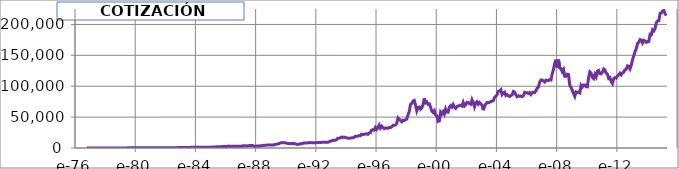
| Category | COTIZACIÓN BERKSHIRE |
|---|---|
| 1976-10-14 | 67 |
| 1976-11-14 | 66 |
| 1976-12-14 | 80 |
| 1977-01-14 | 94 |
| 1977-02-14 | 92 |
| 1977-03-14 | 88 |
| 1977-04-14 | 95 |
| 1977-05-14 | 95 |
| 1977-06-14 | 100 |
| 1977-07-14 | 100 |
| 1977-08-14 | 102 |
| 1977-09-14 | 103 |
| 1977-10-14 | 108 |
| 1977-11-14 | 110 |
| 1977-12-14 | 132 |
| 1978-01-14 | 136 |
| 1978-02-14 | 134 |
| 1978-03-14 | 138 |
| 1978-04-14 | 145 |
| 1978-05-14 | 150 |
| 1978-06-14 | 180 |
| 1978-07-14 | 165 |
| 1978-08-14 | 168 |
| 1978-09-14 | 175 |
| 1978-10-14 | 185 |
| 1978-11-14 | 168 |
| 1978-12-14 | 160 |
| 1979-01-14 | 156 |
| 1979-02-14 | 158 |
| 1979-03-14 | 178 |
| 1979-04-14 | 185 |
| 1979-05-14 | 190 |
| 1979-06-14 | 192 |
| 1979-07-14 | 240 |
| 1979-08-14 | 320 |
| 1979-09-14 | 340 |
| 1979-10-14 | 305 |
| 1979-11-14 | 290 |
| 1979-12-14 | 330 |
| 1980-01-14 | 335 |
| 1980-02-14 | 340 |
| 1980-03-14 | 285 |
| 1980-04-14 | 255 |
| 1980-05-14 | 310 |
| 1980-06-14 | 320 |
| 1980-07-14 | 325 |
| 1980-08-14 | 380 |
| 1980-09-14 | 400 |
| 1980-10-14 | 400 |
| 1980-11-14 | 400 |
| 1980-12-14 | 425 |
| 1981-01-14 | 425 |
| 1981-02-14 | 425 |
| 1981-03-14 | 485 |
| 1981-04-14 | 495 |
| 1981-05-14 | 525 |
| 1981-06-14 | 525 |
| 1981-07-14 | 480 |
| 1981-08-14 | 520 |
| 1981-09-14 | 485 |
| 1981-10-14 | 470 |
| 1981-11-14 | 515 |
| 1981-12-14 | 555 |
| 1982-01-14 | 540 |
| 1982-02-14 | 510 |
| 1982-03-14 | 475 |
| 1982-04-14 | 510 |
| 1982-05-14 | 520 |
| 1982-06-14 | 485 |
| 1982-07-14 | 475 |
| 1982-08-14 | 430 |
| 1982-09-14 | 525 |
| 1982-10-14 | 600 |
| 1982-11-14 | 690 |
| 1982-12-14 | 710 |
| 1983-01-14 | 785 |
| 1983-02-14 | 780 |
| 1983-03-14 | 870 |
| 1983-04-14 | 905 |
| 1983-05-14 | 970 |
| 1983-06-14 | 970 |
| 1983-07-14 | 910 |
| 1983-08-14 | 965 |
| 1983-09-14 | 1145 |
| 1983-10-14 | 1285 |
| 1983-11-14 | 1310 |
| 1983-12-14 | 1370 |
| 1984-01-14 | 1360 |
| 1984-02-14 | 1285 |
| 1984-03-14 | 1270 |
| 1984-04-14 | 1235 |
| 1984-05-14 | 1325 |
| 1984-06-14 | 1285 |
| 1984-07-14 | 1240 |
| 1984-08-14 | 1285 |
| 1984-09-14 | 1295 |
| 1984-10-14 | 1300 |
| 1984-11-14 | 1300 |
| 1984-12-14 | 1265 |
| 1985-01-14 | 1305 |
| 1985-02-14 | 1485 |
| 1985-03-14 | 1480 |
| 1985-04-14 | 1730 |
| 1985-05-14 | 1845 |
| 1985-06-14 | 1900 |
| 1985-07-14 | 2205 |
| 1985-08-14 | 2070 |
| 1985-09-14 | 2065 |
| 1985-10-14 | 2190 |
| 1985-11-14 | 2630 |
| 1985-12-14 | 2620 |
| 1986-01-14 | 2450 |
| 1986-02-14 | 2435 |
| 1986-03-14 | 3200 |
| 1986-04-14 | 2800 |
| 1986-05-14 | 2780 |
| 1986-06-14 | 2820 |
| 1986-07-14 | 2800 |
| 1986-08-14 | 3050 |
| 1986-09-14 | 2675 |
| 1986-10-14 | 2690 |
| 1986-11-14 | 2880 |
| 1986-12-14 | 2730 |
| 1987-01-14 | 3050 |
| 1987-02-14 | 3125 |
| 1987-03-14 | 3630 |
| 1987-04-14 | 3390 |
| 1987-05-14 | 3510 |
| 1987-06-14 | 3380 |
| 1987-07-14 | 3550 |
| 1987-08-14 | 4180 |
| 1987-09-14 | 3890 |
| 1987-10-14 | 4140 |
| 1987-11-14 | 3025 |
| 1987-12-14 | 2975 |
| 1988-01-14 | 3030 |
| 1988-02-14 | 3050 |
| 1988-03-14 | 3150 |
| 1988-04-14 | 3450 |
| 1988-05-14 | 3725 |
| 1988-06-14 | 3950 |
| 1988-07-14 | 4375 |
| 1988-08-14 | 4200 |
| 1988-09-14 | 4550 |
| 1988-10-14 | 4850 |
| 1988-11-14 | 4700 |
| 1988-12-14 | 4900 |
| 1989-01-14 | 4700 |
| 1989-02-14 | 4825 |
| 1989-03-14 | 4785 |
| 1989-04-14 | 5850 |
| 1989-05-14 | 5900 |
| 1989-06-14 | 6675 |
| 1989-07-14 | 6875 |
| 1989-08-14 | 8005 |
| 1989-09-14 | 8700 |
| 1989-10-14 | 8300 |
| 1989-11-14 | 8305 |
| 1989-12-14 | 8475 |
| 1990-01-14 | 8175 |
| 1990-02-14 | 7425 |
| 1990-03-14 | 7120 |
| 1990-04-14 | 6975 |
| 1990-05-14 | 7575 |
| 1990-06-14 | 7225 |
| 1990-07-14 | 7300 |
| 1990-08-14 | 6900 |
| 1990-09-14 | 6225 |
| 1990-10-14 | 5735 |
| 1990-11-14 | 6275 |
| 1990-12-14 | 6750 |
| 1991-01-14 | 6610 |
| 1991-02-14 | 7625 |
| 1991-03-14 | 7975 |
| 1991-04-14 | 8000 |
| 1991-05-14 | 8000 |
| 1991-06-14 | 8475 |
| 1991-07-14 | 8600 |
| 1991-08-14 | 8900 |
| 1991-09-14 | 8450 |
| 1991-10-14 | 8450 |
| 1991-11-14 | 8525 |
| 1991-12-14 | 8375 |
| 1992-01-14 | 8750 |
| 1992-02-14 | 8750 |
| 1992-03-14 | 8850 |
| 1992-04-14 | 8925 |
| 1992-05-14 | 9100 |
| 1992-06-14 | 9110 |
| 1992-07-14 | 9425 |
| 1992-08-14 | 9500 |
| 1992-09-14 | 9200 |
| 1992-10-14 | 9405 |
| 1992-11-14 | 9800 |
| 1992-12-14 | 11150 |
| 1993-01-14 | 11450 |
| 1993-02-14 | 12400 |
| 1993-03-14 | 12700 |
| 1993-04-14 | 12525 |
| 1993-05-14 | 13500 |
| 1993-06-14 | 15725 |
| 1993-07-14 | 15900 |
| 1993-08-14 | 16350 |
| 1993-09-14 | 17710 |
| 1993-10-14 | 17125 |
| 1993-11-14 | 17650 |
| 1993-12-14 | 16900 |
| 1994-01-14 | 16700 |
| 1994-02-14 | 15900 |
| 1994-03-14 | 15650 |
| 1994-04-14 | 16150 |
| 1994-05-14 | 16400 |
| 1994-06-14 | 16500 |
| 1994-07-14 | 17300 |
| 1994-08-14 | 19000 |
| 1994-09-14 | 18900 |
| 1994-10-14 | 19200 |
| 1994-11-14 | 20000 |
| 1994-12-14 | 20000 |
| 1995-01-14 | 22300 |
| 1995-02-14 | 21600 |
| 1995-03-14 | 22200 |
| 1995-04-14 | 22600 |
| 1995-05-14 | 22950 |
| 1995-06-14 | 22200 |
| 1995-07-14 | 24350 |
| 1995-08-14 | 24900 |
| 1995-09-14 | 29000 |
| 1995-10-14 | 29650 |
| 1995-11-14 | 29000 |
| 1995-12-14 | 33300 |
| 1996-01-14 | 30200 |
| 1996-02-14 | 33000 |
| 1996-03-14 | 37100 |
| 1996-04-14 | 32200 |
| 1996-05-14 | 35300 |
| 1996-06-14 | 33100 |
| 1996-07-14 | 31275 |
| 1996-08-14 | 32500 |
| 1996-09-14 | 32150 |
| 1996-10-14 | 31900 |
| 1996-11-14 | 33400 |
| 1996-12-14 | 33000 |
| 1997-01-14 | 34300 |
| 1997-02-14 | 36400 |
| 1997-03-14 | 36900 |
| 1997-04-14 | 37100 |
| 1997-05-14 | 39900 |
| 1997-06-14 | 48600 |
| 1997-07-14 | 46400 |
| 1997-08-14 | 44700 |
| 1997-09-14 | 42500 |
| 1997-10-14 | 45000 |
| 1997-11-14 | 44400 |
| 1997-12-14 | 45700 |
| 1998-01-14 | 46900 |
| 1998-02-14 | 53900 |
| 1998-03-14 | 59300 |
| 1998-04-14 | 70500 |
| 1998-05-14 | 72100 |
| 1998-06-14 | 76000 |
| 1998-07-14 | 77000 |
| 1998-08-14 | 69710 |
| 1998-09-14 | 60200 |
| 1998-10-14 | 65600 |
| 1998-11-14 | 66400 |
| 1998-12-14 | 62800 |
| 1999-01-14 | 64600 |
| 1999-02-14 | 71100 |
| 1999-03-14 | 80300 |
| 1999-04-14 | 73000 |
| 1999-05-14 | 74300 |
| 1999-06-14 | 70800 |
| 1999-07-14 | 71400 |
| 1999-08-14 | 66100 |
| 1999-09-14 | 59800 |
| 1999-10-14 | 57500 |
| 1999-11-14 | 60300 |
| 1999-12-14 | 53400 |
| 2000-01-14 | 52200 |
| 2000-02-14 | 43100 |
| 2000-03-14 | 44000 |
| 2000-04-14 | 58000 |
| 2000-05-14 | 55000 |
| 2000-06-14 | 58700 |
| 2000-07-14 | 54900 |
| 2000-08-14 | 63200 |
| 2000-09-14 | 58100 |
| 2000-10-14 | 58000 |
| 2000-11-14 | 66200 |
| 2000-12-14 | 68600 |
| 2001-01-14 | 66200 |
| 2001-02-14 | 70300 |
| 2001-03-14 | 65900 |
| 2001-04-14 | 64100 |
| 2001-05-14 | 67200 |
| 2001-06-14 | 67700 |
| 2001-07-14 | 69100 |
| 2001-08-14 | 69100 |
| 2001-09-14 | 68000 |
| 2001-10-14 | 73900 |
| 2001-11-14 | 68000 |
| 2001-12-14 | 69950 |
| 2002-01-14 | 73900 |
| 2002-02-14 | 73600 |
| 2002-03-14 | 72000 |
| 2002-04-14 | 71000 |
| 2002-05-14 | 78000 |
| 2002-06-14 | 73000 |
| 2002-07-14 | 66600 |
| 2002-08-14 | 73400 |
| 2002-09-14 | 75000 |
| 2002-10-14 | 70910 |
| 2002-11-14 | 73600 |
| 2002-12-14 | 71200 |
| 2003-01-14 | 69700 |
| 2003-02-14 | 61200 |
| 2003-03-14 | 68100 |
| 2003-04-14 | 70990 |
| 2003-05-14 | 73600 |
| 2003-06-14 | 73300 |
| 2003-07-14 | 74000 |
| 2003-08-14 | 75300 |
| 2003-09-14 | 75800 |
| 2003-10-14 | 76600 |
| 2003-11-14 | 81790 |
| 2003-12-14 | 83600 |
| 2004-01-14 | 86005 |
| 2004-02-14 | 91900 |
| 2004-03-14 | 92150 |
| 2004-04-14 | 94200 |
| 2004-05-14 | 86500 |
| 2004-06-14 | 89100.06 |
| 2004-07-14 | 90400 |
| 2004-08-14 | 85100 |
| 2004-09-14 | 86300 |
| 2004-10-14 | 84400 |
| 2004-11-14 | 83300 |
| 2004-12-14 | 85100 |
| 2005-01-14 | 85850 |
| 2005-02-14 | 91480 |
| 2005-03-14 | 90600 |
| 2005-04-14 | 86000 |
| 2005-05-14 | 83000 |
| 2005-06-14 | 84400 |
| 2005-07-14 | 83700 |
| 2005-08-14 | 84200 |
| 2005-09-14 | 83100 |
| 2005-10-14 | 84600 |
| 2005-11-14 | 90140 |
| 2005-12-14 | 89200.06 |
| 2006-01-14 | 89600 |
| 2006-02-14 | 88100 |
| 2006-03-14 | 89750 |
| 2006-04-14 | 86700 |
| 2006-05-14 | 89503 |
| 2006-06-14 | 90100 |
| 2006-07-14 | 89800 |
| 2006-08-14 | 92685 |
| 2006-09-14 | 96900 |
| 2006-10-14 | 98600 |
| 2006-11-14 | 106475 |
| 2006-12-14 | 110100 |
| 2007-01-14 | 110000 |
| 2007-02-14 | 108500 |
| 2007-03-14 | 106800 |
| 2007-04-14 | 109900 |
| 2007-05-14 | 109350 |
| 2007-06-14 | 109300 |
| 2007-07-14 | 110710 |
| 2007-08-14 | 110150 |
| 2007-09-14 | 120000 |
| 2007-10-14 | 127100 |
| 2007-11-14 | 137500 |
| 2007-12-14 | 143000 |
| 2008-01-14 | 130410 |
| 2008-02-14 | 142990 |
| 2008-03-14 | 129360 |
| 2008-04-14 | 128515 |
| 2008-05-14 | 123500 |
| 2008-06-14 | 127000 |
| 2008-07-14 | 116000 |
| 2008-08-14 | 116200 |
| 2008-09-14 | 119500 |
| 2008-10-14 | 118850 |
| 2008-11-14 | 101000 |
| 2008-12-14 | 98390 |
| 2009-01-14 | 93150 |
| 2009-02-14 | 88140 |
| 2009-03-14 | 83550 |
| 2009-04-14 | 90700 |
| 2009-05-14 | 89600 |
| 2009-06-14 | 90870 |
| 2009-07-14 | 89400 |
| 2009-08-14 | 101400 |
| 2009-09-14 | 98750 |
| 2009-10-14 | 102000 |
| 2009-11-14 | 102055 |
| 2009-12-14 | 99400 |
| 2010-01-14 | 99000 |
| 2010-02-14 | 114000 |
| 2010-03-14 | 123200 |
| 2010-04-14 | 121100 |
| 2010-05-14 | 114150 |
| 2010-06-14 | 112200 |
| 2010-07-14 | 119020 |
| 2010-08-14 | 115180 |
| 2010-09-14 | 124510 |
| 2010-10-14 | 125612 |
| 2010-11-14 | 120351 |
| 2010-12-14 | 120200 |
| 2011-01-14 | 122475 |
| 2011-02-14 | 127850 |
| 2011-03-14 | 126400 |
| 2011-04-14 | 121247 |
| 2011-05-14 | 119493 |
| 2011-06-14 | 112702 |
| 2011-07-14 | 114100 |
| 2011-08-14 | 107600 |
| 2011-09-14 | 104400 |
| 2011-10-14 | 112200 |
| 2011-11-14 | 113921 |
| 2011-12-14 | 113200 |
| 2012-01-14 | 116520 |
| 2012-02-14 | 118475 |
| 2012-03-14 | 121074 |
| 2012-04-14 | 118385 |
| 2012-05-14 | 121675 |
| 2012-06-14 | 122600 |
| 2012-07-14 | 126625 |
| 2012-08-14 | 127375 |
| 2012-09-14 | 133000 |
| 2012-10-14 | 132501.9 |
| 2012-11-14 | 128150 |
| 2012-12-14 | 133795 |
| 2013-01-14 | 143000 |
| 2013-02-14 | 149240 |
| 2013-03-14 | 155990 |
| 2013-04-14 | 160525 |
| 2013-05-14 | 169267 |
| 2013-06-14 | 171259 |
| 2013-07-14 | 175505 |
| 2013-08-14 | 174755 |
| 2013-09-14 | 170155 |
| 2013-10-14 | 174200 |
| 2013-11-14 | 173320 |
| 2013-12-14 | 171100 |
| 2014-01-14 | 172250 |
| 2014-02-14 | 172425 |
| 2014-03-14 | 183860 |
| 2014-04-14 | 183212 |
| 2014-05-14 | 191420 |
| 2014-06-14 | 189520 |
| 2014-07-14 | 193380 |
| 2014-08-14 | 202850 |
| 2014-09-14 | 205635 |
| 2014-10-14 | 206025 |
| 2014-11-14 | 218023 |
| 2014-12-14 | 219000 |
| 2015-01-14 | 221878 |
| 2015-02-14 | 222555 |
| 2015-03-14 | 217118 |
| 2015-04-14 | 214420 |